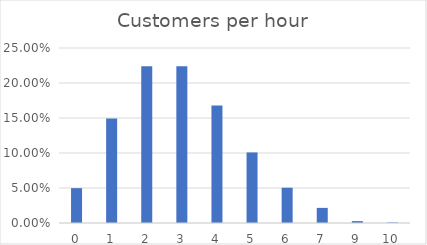
| Category | Series 0 |
|---|---|
| 0.0 | 0.05 |
| 1.0 | 0.149 |
| 2.0 | 0.224 |
| 3.0 | 0.224 |
| 4.0 | 0.168 |
| 5.0 | 0.101 |
| 6.0 | 0.05 |
| 7.0 | 0.022 |
| 9.0 | 0.003 |
| 10.0 | 0.001 |